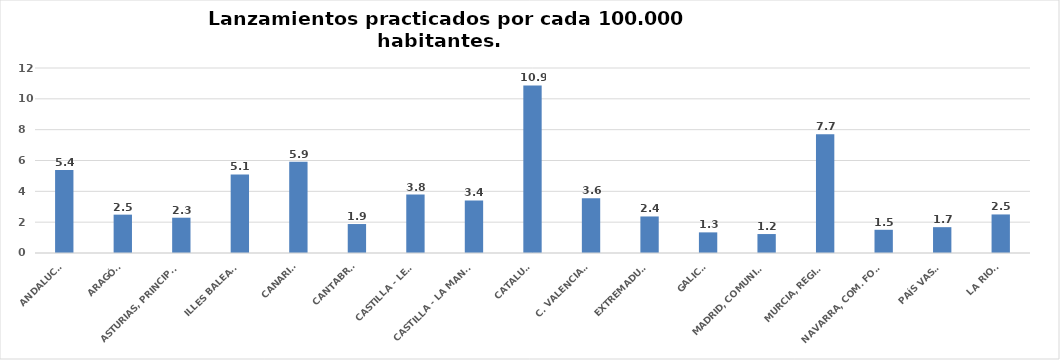
| Category | Series 0 |
|---|---|
| ANDALUCÍA | 5.376 |
| ARAGÓN | 2.488 |
| ASTURIAS, PRINCIPADO | 2.289 |
| ILLES BALEARS | 5.099 |
| CANARIAS | 5.924 |
| CANTABRIA | 1.879 |
| CASTILLA - LEÓN | 3.793 |
| CASTILLA - LA MANCHA | 3.409 |
| CATALUÑA | 10.869 |
| C. VALENCIANA | 3.55 |
| EXTREMADURA | 2.37 |
| GALICIA | 1.338 |
| MADRID, COMUNIDAD | 1.23 |
| MURCIA, REGIÓN | 7.703 |
| NAVARRA, COM. FORAL | 1.506 |
| PAÍS VASCO | 1.676 |
| LA RIOJA | 2.501 |